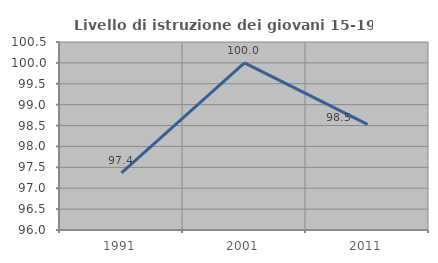
| Category | Livello di istruzione dei giovani 15-19 anni |
|---|---|
| 1991.0 | 97.368 |
| 2001.0 | 100 |
| 2011.0 | 98.529 |